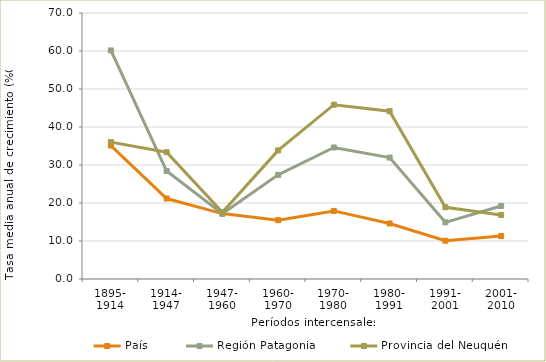
| Category | País | Región Patagonia | Provincia del Neuquén |
|---|---|---|---|
| 1895- 1914 | 35.108 | 60.15 | 36.024 |
| 1914- 1947 | 21.17 | 28.409 | 33.374 |
| 1947- 1960 | 17.214 | 17.186 | 17.585 |
| 1960- 1970 | 15.479 | 27.41 | 33.84 |
| 1970- 1980 | 17.918 | 34.614 | 45.867 |
| 1980- 1991 | 14.615 | 31.955 | 44.169 |
| 1991- 2001 | 10.082 | 14.915 | 18.881 |
| 2001- 2010 | 11.307 | 19.202 | 16.855 |